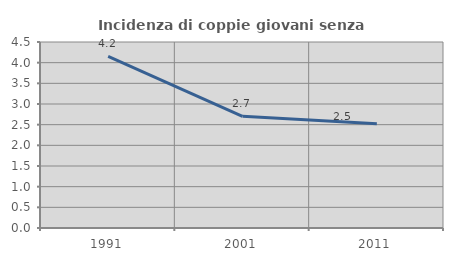
| Category | Incidenza di coppie giovani senza figli |
|---|---|
| 1991.0 | 4.151 |
| 2001.0 | 2.703 |
| 2011.0 | 2.521 |